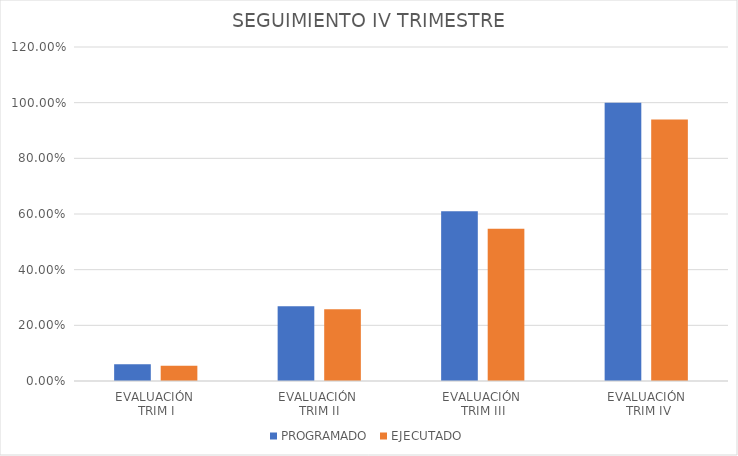
| Category | PROGRAMADO | EJECUTADO |
|---|---|---|
| EVALUACIÓN 
TRIM I | 0.06 | 0.055 |
| EVALUACIÓN 
TRIM II | 0.269 | 0.257 |
| EVALUACIÓN 
TRIM III | 0.61 | 0.547 |
| EVALUACIÓN
 TRIM IV | 1 | 0.939 |